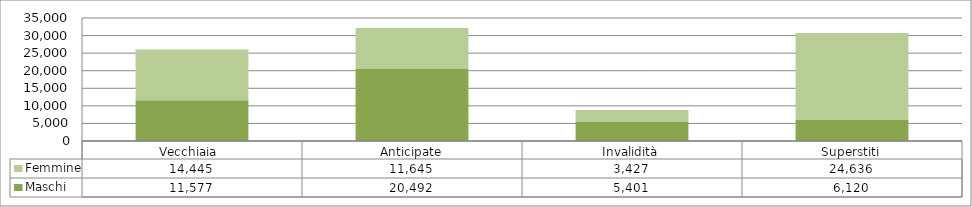
| Category | Maschi | Femmine |
|---|---|---|
| Vecchiaia  | 11577 | 14445 |
| Anticipate | 20492 | 11645 |
| Invalidità | 5401 | 3427 |
| Superstiti | 6120 | 24636 |